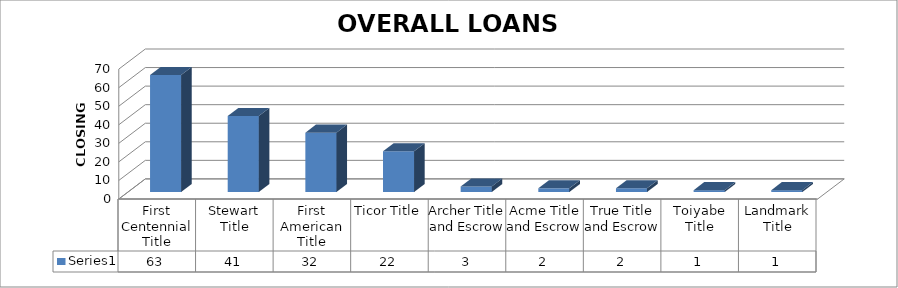
| Category | Series 0 |
|---|---|
| First Centennial Title | 63 |
| Stewart Title | 41 |
| First American Title | 32 |
| Ticor Title | 22 |
| Archer Title and Escrow | 3 |
| Acme Title and Escrow | 2 |
| True Title and Escrow | 2 |
| Toiyabe Title | 1 |
| Landmark Title | 1 |